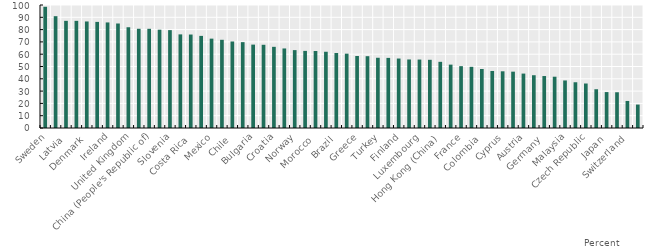
| Category | Series 0 |
|---|---|
| Sweden | 98.542 |
| South Africa | 90.908 |
| Latvia | 87.125 |
| Estonia | 87.117 |
| Denmark | 86.617 |
| Romania | 86.268 |
| Ireland | 85.822 |
| Peru | 84.96 |
| United Kingdom | 81.918 |
| Georgia | 80.671 |
| China (People's Republic of) | 80.648 |
| Netherlands | 79.925 |
| Slovenia | 79.574 |
| Hungary | 76.116 |
| Costa Rica | 75.987 |
| Malta | 74.891 |
| Mexico | 72.649 |
| Argentina | 71.714 |
| Chile | 70.338 |
| New Zealand | 69.806 |
| Bulgaria | 67.797 |
| Kenya | 67.657 |
| Croatia | 65.993 |
| Singapore | 64.666 |
| Norway | 63.322 |
| Korea | 62.695 |
| Morocco | 62.601 |
| Israel | 61.988 |
| Brazil | 60.963 |
| Iceland | 60.445 |
| Greece | 58.538 |
| Lithuania | 58.389 |
| Turkey | 57.098 |
| Australia | 56.994 |
| Finland | 56.477 |
| Indonesia | 55.715 |
| Luxembourg | 55.64 |
| Portugal | 55.45 |
| Hong Kong (China) | 53.803 |
| Canada | 51.522 |
| France | 50.287 |
| Italy | 49.749 |
| Colombia | 47.992 |
| Thailand | 46.368 |
| Cyprus | 46.105 |
| Belgium | 45.808 |
| Austria | 44.241 |
| United States | 42.909 |
| Germany | 42.251 |
| Spain | 41.698 |
| Malaysia | 38.653 |
| Slovak Republic | 37.196 |
| Czech Republic | 36.177 |
| Poland | 31.515 |
| Japan | 29.209 |
| India | 29.057 |
| Switzerland | 21.984 |
| Saudi Arabia | 19.059 |